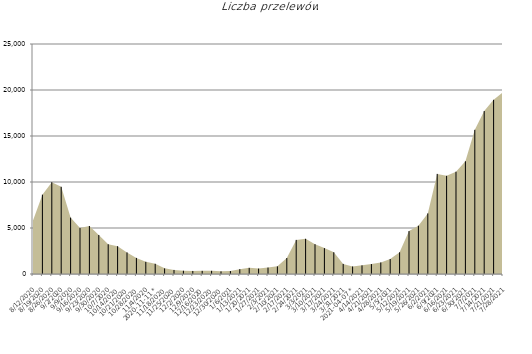
| Category | Liczba przelewów |
|---|---|
| 2020-08-12 | 5814 |
| 2020-08-19 | 8625 |
| 2020-08-26 | 9980 |
| 2020-09-02 | 9479 |
| 2020-09-09 | 6130 |
| 2020-09-16 | 4996 |
| 2020-09-23 | 5219 |
| 2020-09-30 | 4240 |
| 2020-10-07 | 3235 |
| 2020-10-14 | 3021 |
| 2020-10-21 | 2348 |
| 2020-10-28 | 1748 |
| 2020-11-04 | 1326 |
|    2020-11-11 * | 1110 |
| 2020-11-18 | 612 |
| 2020-11-25 | 443 |
| 2020-12-02 | 358 |
| 2020-12-09 | 334 |
| 2020-12-16 | 341 |
| 2020-12-23 | 348 |
| 2020-12-30 | 287 |
| 2021-01-06 | 321 |
| 2021-01-13 | 528 |
| 2021-01-20 | 666 |
| 2021-01-27 | 590 |
| 2021-02-03 | 703 |
| 2021-02-10 | 832 |
| 2021-02-17 | 1735 |
| 2021-02-24 | 3709 |
| 2021-03-03 | 3825 |
| 2021-03-10 | 3242 |
| 2021-03-17 | 2813 |
| 2021-03-24 | 2365 |
| 2021-03-31 | 1099 |
|    2021-04-07 * | 820 |
| 2021-04-14 | 940 |
| 2021-04-21 | 1081 |
| 2021-04-28 | 1256 |
| 2021-05-05 | 1629 |
| 2021-05-12 | 2360 |
| 2021-05-19 | 4667 |
| 2021-05-26 | 5252 |
| 2021-06-02 | 6587 |
| 2021-06-09 | 10883 |
| 2021-06-16 | 10668 |
| 2021-06-23 | 11118 |
| 2021-06-30 | 12257 |
| 2021-07-07 | 15671 |
| 2021-07-14 | 17713 |
| 2021-07-21 | 18933 |
| 2021-07-28 | 19771 |